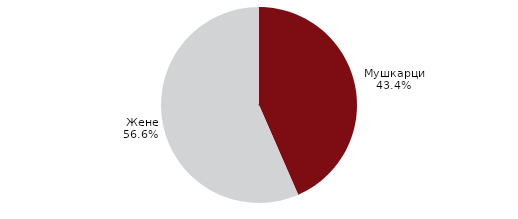
| Category | Series 0 |
|---|---|
|  Мушкарци  | 111301 |
|  Жене | 144871 |